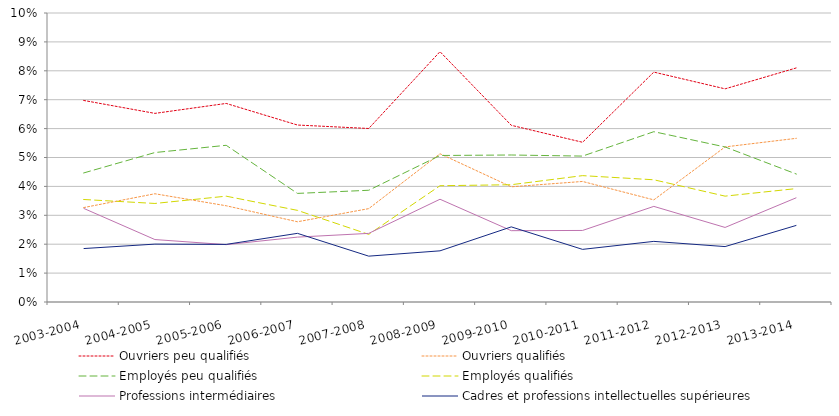
| Category | Ouvriers peu qualifiés | Ouvriers qualifiés | Employés peu qualifiés | Employés qualifiés | Professions intermédiaires | Cadres et professions intellectuelles supérieures |
|---|---|---|---|---|---|---|
| 2003-2004 | 0.07 | 0.033 | 0.045 | 0.035 | 0.032 | 0.018 |
| 2004-2005 | 0.065 | 0.037 | 0.052 | 0.034 | 0.022 | 0.02 |
| 2005-2006 | 0.069 | 0.033 | 0.054 | 0.037 | 0.02 | 0.02 |
| 2006-2007 | 0.061 | 0.028 | 0.038 | 0.032 | 0.022 | 0.024 |
| 2007-2008 | 0.06 | 0.032 | 0.039 | 0.023 | 0.024 | 0.016 |
| 2008-2009 | 0.087 | 0.051 | 0.051 | 0.04 | 0.036 | 0.018 |
| 2009-2010 | 0.061 | 0.04 | 0.051 | 0.041 | 0.025 | 0.026 |
| 2010-2011 | 0.055 | 0.042 | 0.05 | 0.044 | 0.025 | 0.018 |
| 2011-2012 | 0.08 | 0.035 | 0.059 | 0.042 | 0.033 | 0.021 |
| 2012-2013 | 0.074 | 0.054 | 0.054 | 0.037 | 0.026 | 0.019 |
| 2013-2014 | 0.081 | 0.057 | 0.044 | 0.039 | 0.036 | 0.027 |